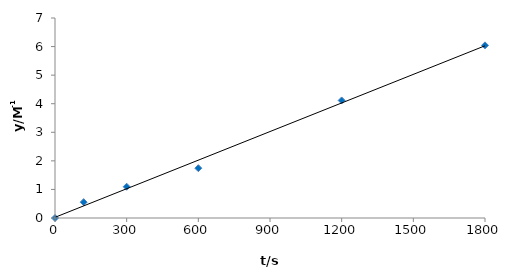
| Category | Series 0 |
|---|---|
| 0.0 | 0 |
| 120.0 | 0.554 |
| 300.0 | 1.094 |
| 600.0 | 1.743 |
| 1200.0 | 4.115 |
| 1800.0 | 6.042 |